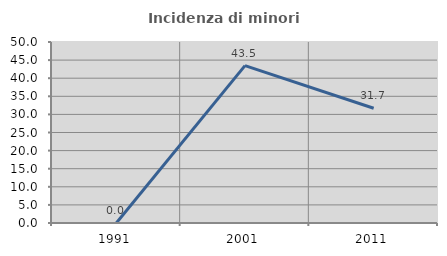
| Category | Incidenza di minori stranieri |
|---|---|
| 1991.0 | 0 |
| 2001.0 | 43.478 |
| 2011.0 | 31.707 |